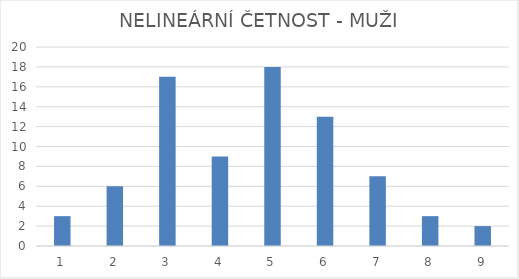
| Category | NELINEÁRNÍ ČETNOST |
|---|---|
| 1.0 | 3 |
| 2.0 | 6 |
| 3.0 | 17 |
| 4.0 | 9 |
| 5.0 | 18 |
| 6.0 | 13 |
| 7.0 | 7 |
| 8.0 | 3 |
| 9.0 | 2 |